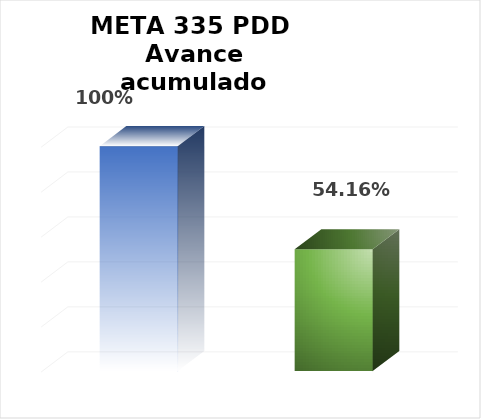
| Category | Meta PDD 2024 |
|---|---|
| 0 | 1 |
| 1 | 0.542 |